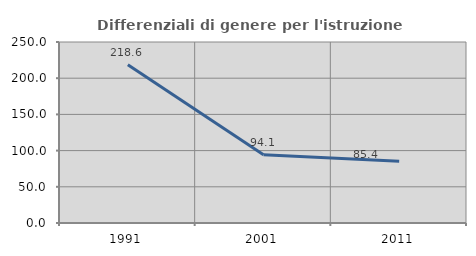
| Category | Differenziali di genere per l'istruzione superiore |
|---|---|
| 1991.0 | 218.605 |
| 2001.0 | 94.128 |
| 2011.0 | 85.352 |